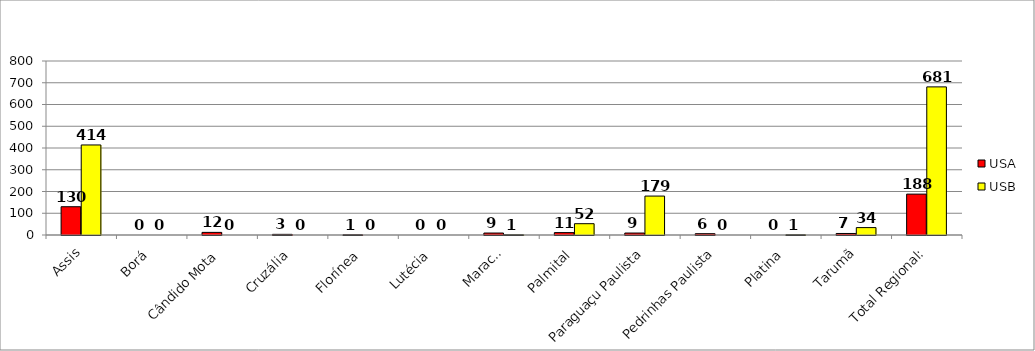
| Category | USA | USB |
|---|---|---|
| Assis | 130 | 414 |
| Borá | 0 | 0 |
| Cândido Mota | 12 | 0 |
| Cruzália | 3 | 0 |
| Florínea | 1 | 0 |
| Lutécia | 0 | 0 |
| Maracaí | 9 | 1 |
| Palmital | 11 | 52 |
| Paraguaçu Paulista | 9 | 179 |
| Pedrinhas Paulista | 6 | 0 |
| Platina | 0 | 1 |
| Tarumã | 7 | 34 |
| Total Regional: | 188 | 681 |